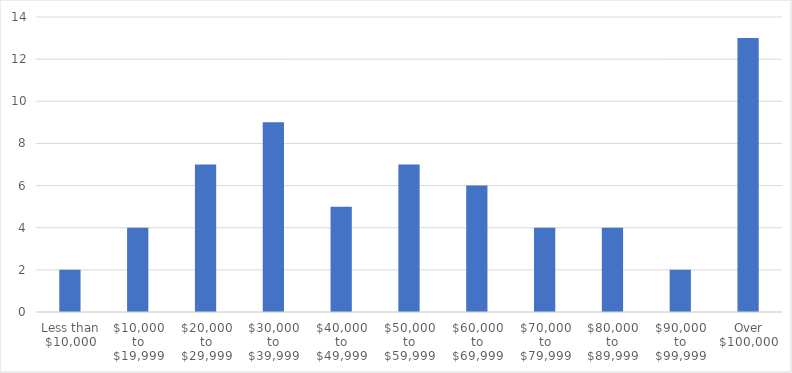
| Category | Number of Responses |
|---|---|
| Less than $10,000 | 2 |
| $10,000 to $19,999 | 4 |
| $20,000 to $29,999 | 7 |
| $30,000 to $39,999 | 9 |
| $40,000 to $49,999 | 5 |
| $50,000 to $59,999 | 7 |
| $60,000 to $69,999 | 6 |
| $70,000 to $79,999 | 4 |
| $80,000 to $89,999 | 4 |
| $90,000 to $99,999 | 2 |
| Over $100,000 | 13 |